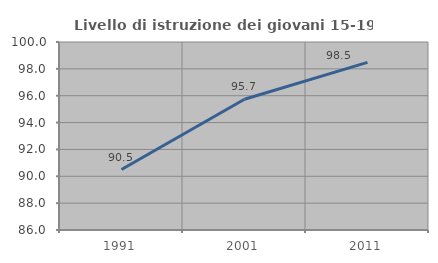
| Category | Livello di istruzione dei giovani 15-19 anni |
|---|---|
| 1991.0 | 90.505 |
| 2001.0 | 95.735 |
| 2011.0 | 98.482 |